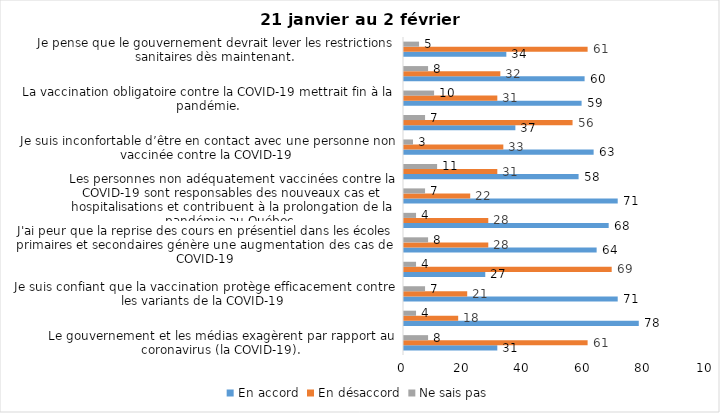
| Category | En accord | En désaccord | Ne sais pas |
|---|---|---|---|
| Le gouvernement et les médias exagèrent par rapport au coronavirus (la COVID-19). | 31 | 61 | 8 |
| J’ai peur que le système de santé soit débordé par les cas de COVID-19. | 78 | 18 | 4 |
| Je suis confiant que la vaccination protège efficacement contre les variants de la COVID-19 | 71 | 21 | 7 |
| Je suis favorable à ce que le port du masque ne soit plus obligatoire au Québec. | 27 | 69 | 4 |
| J'ai peur que la reprise des cours en présentiel dans les écoles primaires et secondaires génère une augmentation des cas de COVID-19 | 64 | 28 | 8 |
| Je crois que le passeport vaccinal devrait être requis pour davantage de services et commerces (ex. : spas, centre d’achats, centre de soins personnels. | 68 | 28 | 4 |
| Les personnes non adéquatement vaccinées contre la COVID-19 sont responsables des nouveaux cas et hospitalisations et contribuent à la prolongation de la pandémie au Québec. | 71 | 22 | 7 |
| La pandémie ne sera pas terminée au Québec avant que tous les habitants de la terre puissent être vaccinés contre la COVID-19.   | 58 | 31 | 11 |
| Je suis inconfortable d’être en contact avec une personne non vaccinée contre la COVID-19 | 63 | 33 | 3 |
| Je n'ai pas peur du variant Omicron, car il semble moins dangereux pour la santé. | 37 | 56 | 7 |
| La vaccination obligatoire contre la COVID-19 mettrait fin à la pandémie. | 59 | 31 | 10 |
| Je suis favorable à ce que les personnes non vaccinées paient une taxe supplémentaire (contribution santé). | 60 | 32 | 8 |
| Je pense que le gouvernement devrait lever les restrictions sanitaires dès maintenant. | 34 | 61 | 5 |